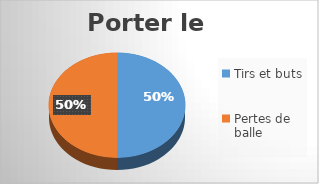
| Category | Series 0 |
|---|---|
| Tirs et buts | 50 |
| Pertes de balle | 50 |